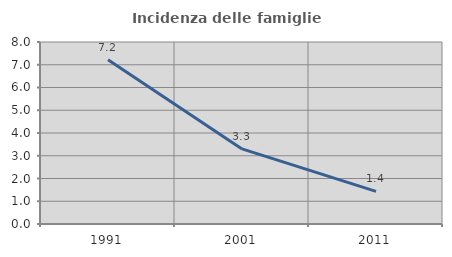
| Category | Incidenza delle famiglie numerose |
|---|---|
| 1991.0 | 7.225 |
| 2001.0 | 3.299 |
| 2011.0 | 1.431 |